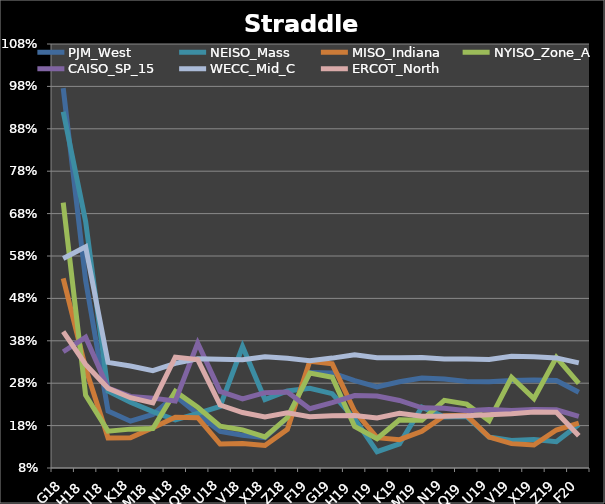
| Category | PJM_West | NEISO_Mass | MISO_Indiana | NYISO_Zone_A | CAISO_SP_15 | WECC_Mid_C | ERCOT_North |
|---|---|---|---|---|---|---|---|
| G18 | 0.976 | 0.92 | 0.527 | 0.706 | 0.354 | 0.574 | 0.402 |
| H18 | 0.522 | 0.662 | 0.315 | 0.252 | 0.388 | 0.602 | 0.324 |
| J18 | 0.214 | 0.262 | 0.151 | 0.167 | 0.269 | 0.329 | 0.268 |
| K18 | 0.19 | 0.235 | 0.151 | 0.172 | 0.249 | 0.321 | 0.246 |
| M18 | 0.206 | 0.213 | 0.175 | 0.173 | 0.245 | 0.31 | 0.233 |
| N18 | 0.25 | 0.193 | 0.2 | 0.261 | 0.238 | 0.327 | 0.342 |
| Q18 | 0.207 | 0.209 | 0.199 | 0.223 | 0.375 | 0.337 | 0.336 |
| U18 | 0.166 | 0.225 | 0.137 | 0.178 | 0.261 | 0.336 | 0.229 |
| V18 | 0.157 | 0.366 | 0.138 | 0.17 | 0.243 | 0.335 | 0.211 |
| X18 | 0.151 | 0.241 | 0.133 | 0.153 | 0.258 | 0.342 | 0.201 |
| Z18 | 0.198 | 0.262 | 0.171 | 0.199 | 0.259 | 0.339 | 0.21 |
| F19 | 0.305 | 0.268 | 0.332 | 0.304 | 0.22 | 0.333 | 0.201 |
| G19 | 0.304 | 0.255 | 0.326 | 0.294 | 0.234 | 0.339 | 0.203 |
| H19 | 0.286 | 0.196 | 0.214 | 0.178 | 0.251 | 0.347 | 0.204 |
| J19 | 0.271 | 0.118 | 0.152 | 0.149 | 0.25 | 0.34 | 0.198 |
| K19 | 0.283 | 0.137 | 0.147 | 0.194 | 0.239 | 0.34 | 0.209 |
| M19 | 0.292 | 0.223 | 0.167 | 0.193 | 0.222 | 0.34 | 0.202 |
| N19 | 0.29 | 0.2 | 0.203 | 0.24 | 0.221 | 0.337 | 0.202 |
| Q19 | 0.284 | 0.201 | 0.204 | 0.231 | 0.215 | 0.337 | 0.203 |
| U19 | 0.284 | 0.153 | 0.153 | 0.191 | 0.218 | 0.336 | 0.206 |
| V19 | 0.287 | 0.145 | 0.137 | 0.294 | 0.216 | 0.343 | 0.208 |
| X19 | 0.288 | 0.147 | 0.134 | 0.244 | 0.218 | 0.342 | 0.212 |
| Z19 | 0.286 | 0.142 | 0.17 | 0.341 | 0.217 | 0.34 | 0.212 |
| F20 | 0.258 | 0.182 | 0.186 | 0.279 | 0.202 | 0.328 | 0.156 |